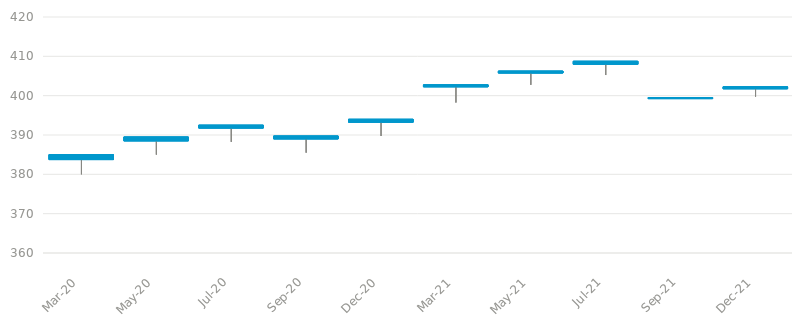
| Category | High | Low | Close |
|---|---|---|---|
| Mar-20 | 385 | 380 | 383.75 |
| May-20 | 389.5 | 385 | 388.5 |
| Jul-20 | 392.5 | 388.25 | 391.75 |
| Sep-20 | 389.75 | 385.5 | 389 |
| Dec-20 | 394 | 389.75 | 393.25 |
| Mar-21 | 402.75 | 398.25 | 402.25 |
| May-21 | 406.25 | 402.75 | 405.75 |
| Jul-21 | 408.75 | 405.25 | 408 |
| Sep-21 | 399.5 | 399.5 | 399.5 |
| Dec-21 | 402.25 | 399.75 | 401.75 |